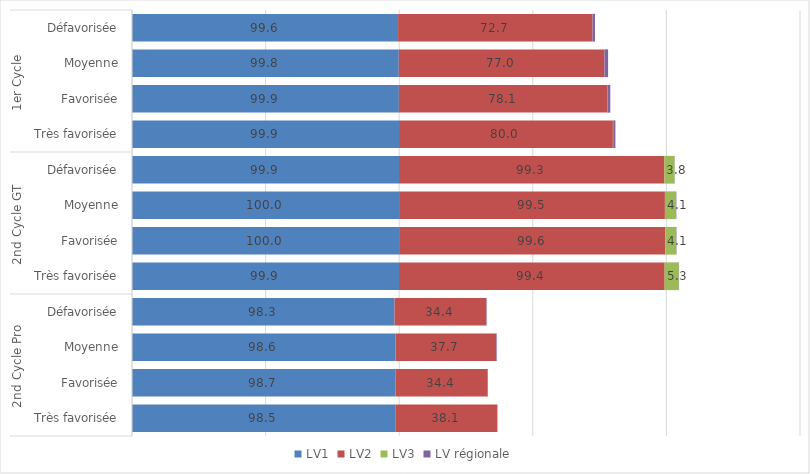
| Category | LV1 | LV2 | LV3 | LV régionale |
|---|---|---|---|---|
| 0 | 99.592 | 72.747 | 0.012 | 0.921 |
| 1 | 99.832 | 76.969 | 0.02 | 1.358 |
| 2 | 99.872 | 78.058 | 0.019 | 1.052 |
| 3 | 99.941 | 80.04 | 0.108 | 0.829 |
| 4 | 99.933 | 99.331 | 3.791 | 0.064 |
| 5 | 99.963 | 99.48 | 4.141 | 0.139 |
| 6 | 99.968 | 99.64 | 4.082 | 0.12 |
| 7 | 99.928 | 99.415 | 5.301 | 0.1 |
| 8 | 98.251 | 34.364 | 0.02 | 0.143 |
| 9 | 98.609 | 37.701 | 0.017 | 0.206 |
| 10 | 98.677 | 34.416 | 0.015 | 0.138 |
| 11 | 98.542 | 38.134 | 0.01 | 0.114 |